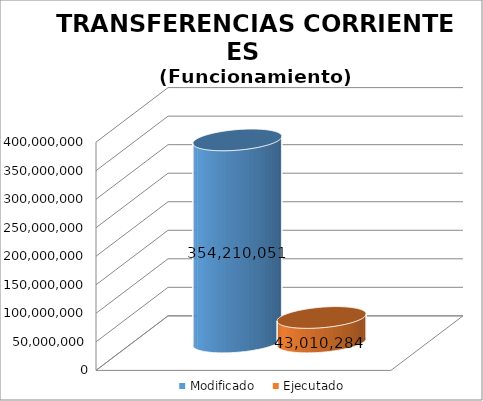
| Category | Modificado | Ejecutado |
|---|---|---|
| 0 | 354210051 | 43010284.32 |